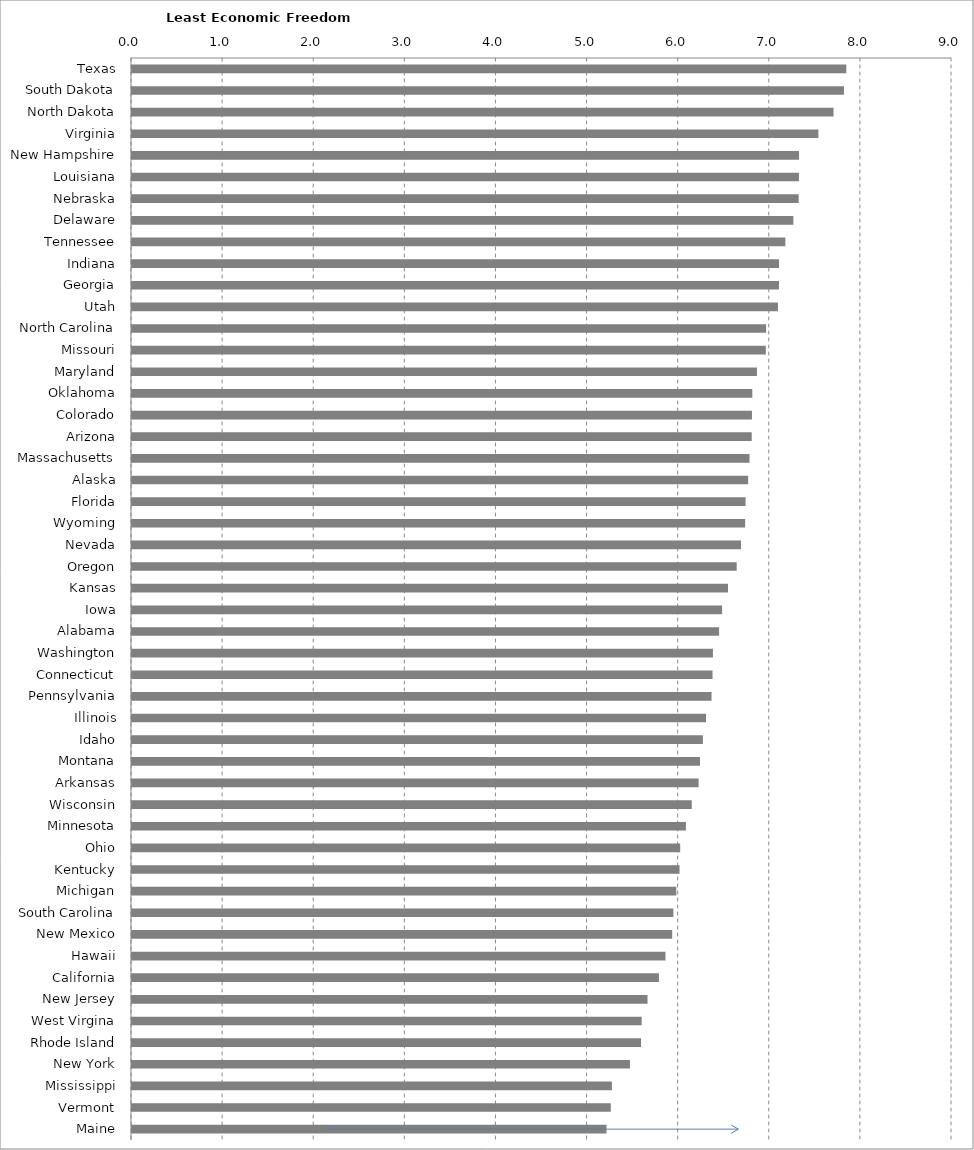
| Category | Series 0 |
|---|---|
| Texas | 7.84 |
| South Dakota | 7.814 |
| North Dakota | 7.7 |
| Virginia | 7.533 |
| New Hampshire | 7.321 |
| Louisiana | 7.32 |
| Nebraska | 7.317 |
| Delaware | 7.259 |
| Tennessee | 7.171 |
| Indiana | 7.101 |
| Georgia | 7.101 |
| Utah | 7.089 |
| North Carolina | 6.96 |
| Missouri | 6.956 |
| Maryland | 6.859 |
| Oklahoma | 6.808 |
| Colorado | 6.804 |
| Arizona | 6.802 |
| Massachusetts | 6.778 |
| Alaska | 6.763 |
| Florida | 6.734 |
| Wyoming | 6.73 |
| Nevada | 6.684 |
| Oregon | 6.637 |
| Kansas | 6.541 |
| Iowa | 6.476 |
| Alabama | 6.444 |
| Washington | 6.376 |
| Connecticut | 6.372 |
| Pennsylvania | 6.361 |
| Illinois | 6.3 |
| Idaho | 6.266 |
| Montana | 6.234 |
| Arkansas | 6.219 |
| Wisconsin | 6.144 |
| Minnesota | 6.079 |
| Ohio | 6.017 |
| Kentucky | 6.009 |
| Michigan | 5.974 |
| South Carolina | 5.942 |
| New Mexico | 5.929 |
| Hawaii | 5.855 |
| California | 5.783 |
| New Jersey | 5.658 |
| West Virgina | 5.594 |
| Rhode Island | 5.587 |
| New York | 5.465 |
| Mississippi | 5.267 |
| Vermont | 5.255 |
| Maine | 5.207 |